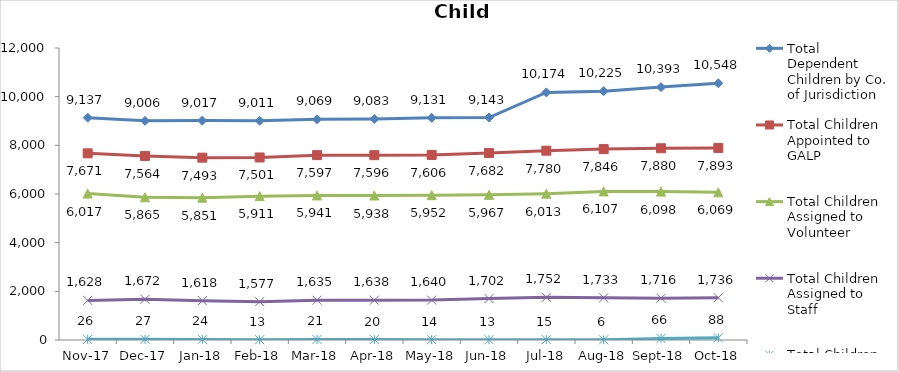
| Category | Total Dependent Children by Co. of Jurisdiction | Total Children Appointed to GALP | Total Children Assigned to Volunteer | Total Children Assigned to Staff | Total Children Unassigned |
|---|---|---|---|---|---|
| 2017-11-01 | 9137 | 7671 | 6017 | 1628 | 26 |
| 2017-12-01 | 9006 | 7564 | 5865 | 1672 | 27 |
| 2018-01-01 | 9017 | 7493 | 5851 | 1618 | 24 |
| 2018-02-01 | 9011 | 7501 | 5911 | 1577 | 13 |
| 2018-03-01 | 9069 | 7597 | 5941 | 1635 | 21 |
| 2018-04-01 | 9083 | 7596 | 5938 | 1638 | 20 |
| 2018-05-01 | 9131 | 7606 | 5952 | 1640 | 14 |
| 2018-06-01 | 9143 | 7682 | 5967 | 1702 | 13 |
| 2018-07-01 | 10174 | 7780 | 6013 | 1752 | 15 |
| 2018-08-01 | 10225 | 7846 | 6107 | 1733 | 6 |
| 2018-09-01 | 10393 | 7880 | 6098 | 1716 | 66 |
| 2018-10-01 | 10548 | 7893 | 6069 | 1736 | 88 |